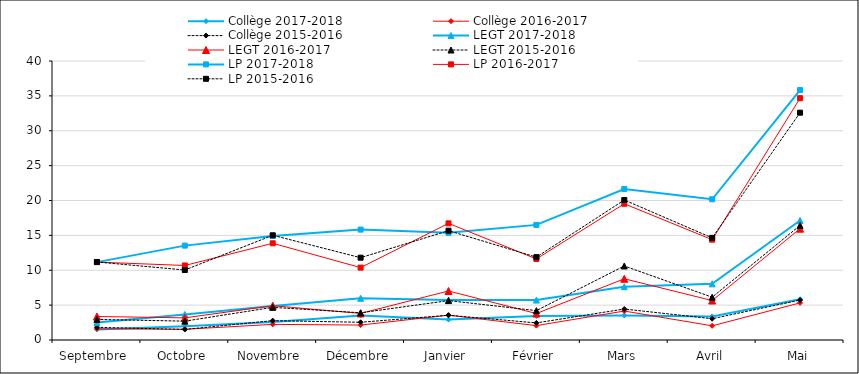
| Category | Collège 2017-2018 | Collège 2016-2017 | Collège 2015-2016 | LEGT 2017-2018 | LEGT 2016-2017 | LEGT 2015-2016 | LP 2017-2018 | LP 2016-2017 | LP 2015-2016 |
|---|---|---|---|---|---|---|---|---|---|
| Septembre | 1.522 | 1.601 | 1.816 | 2.502 | 3.368 | 2.951 | 11.165 | 11.169 | 11.185 |
| Octobre | 1.972 | 1.534 | 1.52 | 3.658 | 3.173 | 2.702 | 13.531 | 10.683 | 10.034 |
| Novembre | 2.587 | 2.24 | 2.772 | 4.887 | 4.917 | 4.68 | 14.906 | 13.864 | 15.015 |
| Décembre | 3.521 | 2.144 | 2.541 | 5.982 | 3.811 | 3.901 | 15.827 | 10.379 | 11.8 |
| Janvier | 2.931 | 3.556 | 3.55 | 5.737 | 7.029 | 5.648 | 15.362 | 16.721 | 15.671 |
| Février | 3.436 | 2.062 | 2.453 | 5.724 | 3.791 | 4.213 | 16.503 | 11.62 | 11.878 |
| Mars | 3.51 | 4.151 | 4.439 | 7.641 | 8.778 | 10.614 | 21.641 | 19.531 | 20.072 |
| Avril | 3.382 | 2.031 | 3.055 | 8.055 | 5.655 | 6.135 | 20.177 | 14.383 | 14.641 |
| Mai | 5.843 | 5.32 | 5.724 | 17.134 | 15.962 | 16.43 | 35.834 | 34.67 | 32.59 |